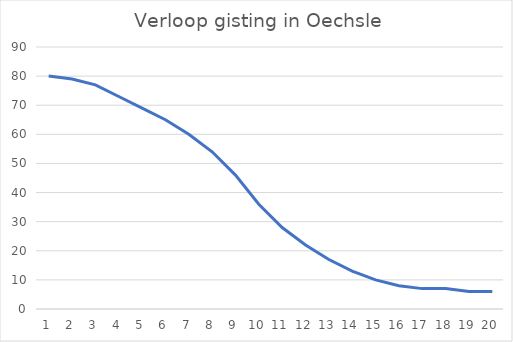
| Category | Series 0 |
|---|---|
| 0 | 80 |
| 1 | 79 |
| 2 | 77 |
| 3 | 73 |
| 4 | 69 |
| 5 | 65 |
| 6 | 60 |
| 7 | 54 |
| 8 | 46 |
| 9 | 36 |
| 10 | 28 |
| 11 | 22 |
| 12 | 17 |
| 13 | 13 |
| 14 | 10 |
| 15 | 8 |
| 16 | 7 |
| 17 | 7 |
| 18 | 6 |
| 19 | 6 |